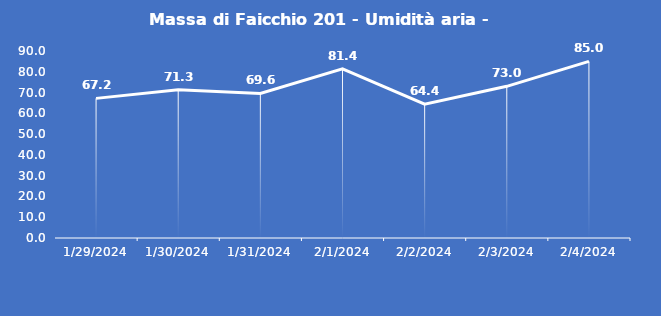
| Category | Massa di Faicchio 201 - Umidità aria - Grezzo (%) |
|---|---|
| 1/29/24 | 67.2 |
| 1/30/24 | 71.3 |
| 1/31/24 | 69.6 |
| 2/1/24 | 81.4 |
| 2/2/24 | 64.4 |
| 2/3/24 | 73 |
| 2/4/24 | 85 |